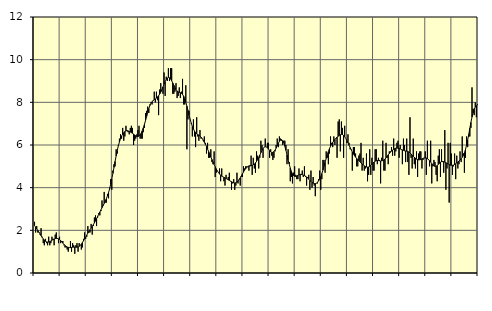
| Category | Piggar | Series 1 |
|---|---|---|
| nan | 2.4 | 2.22 |
| 87.0 | 1.9 | 2.15 |
| 87.0 | 2.2 | 2.07 |
| 87.0 | 1.9 | 2 |
| 87.0 | 1.9 | 1.92 |
| 87.0 | 1.8 | 1.84 |
| 87.0 | 2.1 | 1.75 |
| 87.0 | 1.7 | 1.67 |
| 87.0 | 1.4 | 1.6 |
| 87.0 | 1.3 | 1.54 |
| 87.0 | 1.6 | 1.49 |
| 87.0 | 1.4 | 1.46 |
| nan | 1.3 | 1.45 |
| 88.0 | 1.7 | 1.45 |
| 88.0 | 1.3 | 1.47 |
| 88.0 | 1.4 | 1.5 |
| 88.0 | 1.7 | 1.54 |
| 88.0 | 1.6 | 1.57 |
| 88.0 | 1.3 | 1.59 |
| 88.0 | 1.8 | 1.61 |
| 88.0 | 1.9 | 1.62 |
| 88.0 | 1.6 | 1.62 |
| 88.0 | 1.4 | 1.6 |
| 88.0 | 1.7 | 1.57 |
| nan | 1.4 | 1.52 |
| 89.0 | 1.5 | 1.46 |
| 89.0 | 1.5 | 1.4 |
| 89.0 | 1.3 | 1.34 |
| 89.0 | 1.2 | 1.29 |
| 89.0 | 1.2 | 1.25 |
| 89.0 | 1.1 | 1.22 |
| 89.0 | 1 | 1.2 |
| 89.0 | 1.2 | 1.19 |
| 89.0 | 1.5 | 1.19 |
| 89.0 | 1 | 1.2 |
| 89.0 | 1.4 | 1.21 |
| nan | 1.3 | 1.21 |
| 90.0 | 0.9 | 1.21 |
| 90.0 | 1.3 | 1.21 |
| 90.0 | 1.4 | 1.21 |
| 90.0 | 1 | 1.22 |
| 90.0 | 1.4 | 1.25 |
| 90.0 | 1.3 | 1.29 |
| 90.0 | 1.1 | 1.35 |
| 90.0 | 1.2 | 1.43 |
| 90.0 | 1.6 | 1.51 |
| 90.0 | 1.9 | 1.6 |
| 90.0 | 1.6 | 1.69 |
| nan | 1.7 | 1.78 |
| 91.0 | 2.2 | 1.87 |
| 91.0 | 1.9 | 1.95 |
| 91.0 | 1.9 | 2.03 |
| 91.0 | 2.3 | 2.11 |
| 91.0 | 1.8 | 2.18 |
| 91.0 | 2.2 | 2.26 |
| 91.0 | 2.6 | 2.35 |
| 91.0 | 2.7 | 2.44 |
| 91.0 | 2.2 | 2.55 |
| 91.0 | 2.6 | 2.65 |
| 91.0 | 2.8 | 2.76 |
| nan | 2.7 | 2.86 |
| 92.0 | 2.9 | 2.96 |
| 92.0 | 3.4 | 3.06 |
| 92.0 | 3.2 | 3.16 |
| 92.0 | 3.8 | 3.26 |
| 92.0 | 3.3 | 3.36 |
| 92.0 | 3.3 | 3.48 |
| 92.0 | 3.7 | 3.62 |
| 92.0 | 3.5 | 3.77 |
| 92.0 | 4 | 3.95 |
| 92.0 | 4.4 | 4.17 |
| 92.0 | 3.9 | 4.41 |
| nan | 4.8 | 4.67 |
| 93.0 | 5.1 | 4.95 |
| 93.0 | 5 | 5.23 |
| 93.0 | 5.8 | 5.49 |
| 93.0 | 5.6 | 5.74 |
| 93.0 | 6 | 5.96 |
| 93.0 | 6.3 | 6.14 |
| 93.0 | 6.5 | 6.3 |
| 93.0 | 6.3 | 6.42 |
| 93.0 | 6.8 | 6.51 |
| 93.0 | 6.2 | 6.58 |
| 93.0 | 6.4 | 6.63 |
| nan | 6.9 | 6.66 |
| 94.0 | 6.7 | 6.67 |
| 94.0 | 6.6 | 6.66 |
| 94.0 | 6.5 | 6.64 |
| 94.0 | 6.8 | 6.61 |
| 94.0 | 6.9 | 6.58 |
| 94.0 | 6.8 | 6.55 |
| 94.0 | 6 | 6.51 |
| 94.0 | 6.2 | 6.47 |
| 94.0 | 6.3 | 6.43 |
| 94.0 | 6.5 | 6.4 |
| 94.0 | 6.7 | 6.4 |
| nan | 6.9 | 6.42 |
| 95.0 | 6.3 | 6.47 |
| 95.0 | 6.3 | 6.55 |
| 95.0 | 6.3 | 6.67 |
| 95.0 | 6.6 | 6.81 |
| 95.0 | 6.8 | 6.97 |
| 95.0 | 7.5 | 7.15 |
| 95.0 | 7.6 | 7.34 |
| 95.0 | 7.8 | 7.53 |
| 95.0 | 7.5 | 7.7 |
| 95.0 | 7.9 | 7.85 |
| 95.0 | 8 | 7.96 |
| nan | 7.9 | 8.03 |
| 96.0 | 8.1 | 8.08 |
| 96.0 | 8.5 | 8.12 |
| 96.0 | 8 | 8.16 |
| 96.0 | 8.5 | 8.2 |
| 96.0 | 8.1 | 8.25 |
| 96.0 | 7.4 | 8.31 |
| 96.0 | 8.6 | 8.39 |
| 96.0 | 8.9 | 8.48 |
| 96.0 | 8.6 | 8.59 |
| 96.0 | 8.4 | 8.72 |
| 96.0 | 9.4 | 8.85 |
| nan | 8.3 | 8.97 |
| 97.0 | 9.2 | 9.07 |
| 97.0 | 9 | 9.14 |
| 97.0 | 9.6 | 9.17 |
| 97.0 | 9 | 9.15 |
| 97.0 | 9.6 | 9.1 |
| 97.0 | 9.6 | 9.01 |
| 97.0 | 8.4 | 8.91 |
| 97.0 | 8.4 | 8.8 |
| 97.0 | 8.5 | 8.69 |
| 97.0 | 8.9 | 8.6 |
| 97.0 | 8.2 | 8.53 |
| nan | 8.3 | 8.49 |
| 98.0 | 8.7 | 8.47 |
| 98.0 | 8.2 | 8.45 |
| 98.0 | 8.5 | 8.42 |
| 98.0 | 9.1 | 8.37 |
| 98.0 | 7.9 | 8.29 |
| 98.0 | 7.9 | 8.17 |
| 98.0 | 8.8 | 8.01 |
| 98.0 | 5.8 | 7.82 |
| 98.0 | 7.2 | 7.62 |
| 98.0 | 7.6 | 7.41 |
| 98.0 | 7.2 | 7.21 |
| nan | 7 | 7.03 |
| 99.0 | 6.4 | 6.87 |
| 99.0 | 7.2 | 6.75 |
| 99.0 | 6.4 | 6.65 |
| 99.0 | 5.9 | 6.58 |
| 99.0 | 7.3 | 6.53 |
| 99.0 | 6.4 | 6.49 |
| 99.0 | 6.2 | 6.46 |
| 99.0 | 6.7 | 6.42 |
| 99.0 | 6.3 | 6.37 |
| 99.0 | 6.3 | 6.31 |
| 99.0 | 6.2 | 6.23 |
| nan | 6.4 | 6.13 |
| 0.0 | 6.1 | 6.03 |
| 0.0 | 5.6 | 5.93 |
| 0.0 | 6.1 | 5.81 |
| 0.0 | 5.4 | 5.69 |
| 0.0 | 5.4 | 5.57 |
| 0.0 | 5.8 | 5.44 |
| 0.0 | 5.2 | 5.32 |
| 0.0 | 5.1 | 5.2 |
| 0.0 | 5.7 | 5.09 |
| 0.0 | 4.5 | 4.98 |
| 0.0 | 4.7 | 4.88 |
| nan | 4.8 | 4.79 |
| 1.0 | 4.7 | 4.71 |
| 1.0 | 4.9 | 4.64 |
| 1.0 | 4.3 | 4.58 |
| 1.0 | 4.9 | 4.54 |
| 1.0 | 4.5 | 4.51 |
| 1.0 | 4.3 | 4.48 |
| 1.0 | 4.1 | 4.46 |
| 1.0 | 4.6 | 4.43 |
| 1.0 | 4.4 | 4.4 |
| 1.0 | 4.5 | 4.37 |
| 1.0 | 4.7 | 4.34 |
| nan | 4.3 | 4.31 |
| 2.0 | 3.9 | 4.28 |
| 2.0 | 4.2 | 4.25 |
| 2.0 | 4.4 | 4.23 |
| 2.0 | 3.9 | 4.22 |
| 2.0 | 4.1 | 4.23 |
| 2.0 | 4.7 | 4.26 |
| 2.0 | 4.2 | 4.31 |
| 2.0 | 4.4 | 4.38 |
| 2.0 | 4.1 | 4.46 |
| 2.0 | 4.5 | 4.55 |
| 2.0 | 4.5 | 4.64 |
| nan | 5 | 4.73 |
| 3.0 | 4.9 | 4.82 |
| 3.0 | 5 | 4.89 |
| 3.0 | 5 | 4.95 |
| 3.0 | 5 | 4.99 |
| 3.0 | 4.8 | 5.02 |
| 3.0 | 5 | 5.03 |
| 3.0 | 5.5 | 5.04 |
| 3.0 | 4.6 | 5.05 |
| 3.0 | 5.4 | 5.08 |
| 3.0 | 4.9 | 5.11 |
| 3.0 | 4.7 | 5.16 |
| nan | 5.7 | 5.23 |
| 4.0 | 5.5 | 5.32 |
| 4.0 | 4.9 | 5.41 |
| 4.0 | 5.4 | 5.52 |
| 4.0 | 6.2 | 5.64 |
| 4.0 | 6 | 5.75 |
| 4.0 | 5.4 | 5.84 |
| 4.0 | 5.9 | 5.9 |
| 4.0 | 6.3 | 5.92 |
| 4.0 | 5.9 | 5.91 |
| 4.0 | 6.1 | 5.87 |
| 4.0 | 6.1 | 5.81 |
| nan | 5.4 | 5.74 |
| 5.0 | 5.8 | 5.69 |
| 5.0 | 5.5 | 5.65 |
| 5.0 | 5.3 | 5.65 |
| 5.0 | 5.4 | 5.69 |
| 5.0 | 5.7 | 5.76 |
| 5.0 | 6 | 5.85 |
| 5.0 | 6.3 | 5.97 |
| 5.0 | 5.9 | 6.08 |
| 5.0 | 6.4 | 6.17 |
| 5.0 | 6.3 | 6.23 |
| 5.0 | 6.2 | 6.25 |
| nan | 6 | 6.2 |
| 6.0 | 6.2 | 6.1 |
| 6.0 | 6.2 | 5.94 |
| 6.0 | 6 | 5.75 |
| 6.0 | 5.1 | 5.53 |
| 6.0 | 5.8 | 5.31 |
| 6.0 | 5.2 | 5.11 |
| 6.0 | 4.3 | 4.92 |
| 6.0 | 4.5 | 4.76 |
| 6.0 | 4.2 | 4.65 |
| 6.0 | 4.7 | 4.57 |
| 6.0 | 5 | 4.53 |
| nan | 4.6 | 4.53 |
| 7.0 | 4.4 | 4.55 |
| 7.0 | 4.4 | 4.58 |
| 7.0 | 4.9 | 4.6 |
| 7.0 | 4.3 | 4.62 |
| 7.0 | 4.6 | 4.63 |
| 7.0 | 4.8 | 4.61 |
| 7.0 | 4.5 | 4.59 |
| 7.0 | 5 | 4.57 |
| 7.0 | 4.5 | 4.54 |
| 7.0 | 4.1 | 4.5 |
| 7.0 | 4.5 | 4.45 |
| nan | 4.6 | 4.4 |
| 8.0 | 3.9 | 4.34 |
| 8.0 | 4.8 | 4.29 |
| 8.0 | 4 | 4.25 |
| 8.0 | 4.5 | 4.21 |
| 8.0 | 4.1 | 4.19 |
| 8.0 | 3.6 | 4.19 |
| 8.0 | 4.2 | 4.21 |
| 8.0 | 4.2 | 4.25 |
| 8.0 | 4.4 | 4.32 |
| 8.0 | 4.8 | 4.4 |
| 8.0 | 3.9 | 4.52 |
| nan | 4.4 | 4.66 |
| 9.0 | 5.3 | 4.82 |
| 9.0 | 5.3 | 5 |
| 9.0 | 4.7 | 5.18 |
| 9.0 | 5.7 | 5.37 |
| 9.0 | 5.4 | 5.54 |
| 9.0 | 5.1 | 5.69 |
| 9.0 | 5.6 | 5.83 |
| 9.0 | 6.4 | 5.94 |
| 9.0 | 6.1 | 6.03 |
| 9.0 | 5.9 | 6.12 |
| 9.0 | 6.4 | 6.19 |
| nan | 6 | 6.26 |
| 10.0 | 6.3 | 6.32 |
| 10.0 | 5.4 | 6.37 |
| 10.0 | 7.1 | 6.41 |
| 10.0 | 7.2 | 6.45 |
| 10.0 | 5.7 | 6.48 |
| 10.0 | 7.1 | 6.5 |
| 10.0 | 6.8 | 6.49 |
| 10.0 | 5.4 | 6.45 |
| 10.0 | 6.9 | 6.39 |
| 10.0 | 6.3 | 6.3 |
| 10.0 | 6.1 | 6.21 |
| nan | 6.5 | 6.1 |
| 11.0 | 6.1 | 5.99 |
| 11.0 | 5.8 | 5.88 |
| 11.0 | 5.8 | 5.78 |
| 11.0 | 4.8 | 5.67 |
| 11.0 | 5.9 | 5.58 |
| 11.0 | 5.9 | 5.5 |
| 11.0 | 5.6 | 5.43 |
| 11.0 | 5 | 5.37 |
| 11.0 | 5 | 5.32 |
| 11.0 | 5.5 | 5.27 |
| 11.0 | 5.6 | 5.22 |
| nan | 6.1 | 5.16 |
| 12.0 | 4.8 | 5.11 |
| 12.0 | 5.4 | 5.07 |
| 12.0 | 4.8 | 5.02 |
| 12.0 | 4.9 | 4.99 |
| 12.0 | 5.6 | 4.97 |
| 12.0 | 4.3 | 4.96 |
| 12.0 | 4.6 | 4.97 |
| 12.0 | 5.8 | 5 |
| 12.0 | 4.6 | 5.05 |
| 12.0 | 5.4 | 5.1 |
| 12.0 | 4.8 | 5.16 |
| nan | 4.8 | 5.2 |
| 13.0 | 5.8 | 5.24 |
| 13.0 | 5.8 | 5.26 |
| 13.0 | 5.1 | 5.27 |
| 13.0 | 5.4 | 5.27 |
| 13.0 | 5.3 | 5.26 |
| 13.0 | 4.2 | 5.25 |
| 13.0 | 5.4 | 5.26 |
| 13.0 | 6.2 | 5.27 |
| 13.0 | 4.8 | 5.3 |
| 13.0 | 4.8 | 5.34 |
| 13.0 | 6.1 | 5.4 |
| nan | 5.4 | 5.47 |
| 14.0 | 5.1 | 5.54 |
| 14.0 | 5.7 | 5.6 |
| 14.0 | 5.7 | 5.66 |
| 14.0 | 5.9 | 5.72 |
| 14.0 | 5.5 | 5.76 |
| 14.0 | 6.3 | 5.8 |
| 14.0 | 5.5 | 5.83 |
| 14.0 | 5.7 | 5.85 |
| 14.0 | 6.1 | 5.86 |
| 14.0 | 6.2 | 5.85 |
| 14.0 | 5.4 | 5.84 |
| nan | 6 | 5.82 |
| 15.0 | 5.8 | 5.79 |
| 15.0 | 5.1 | 5.77 |
| 15.0 | 6.3 | 5.75 |
| 15.0 | 6 | 5.73 |
| 15.0 | 5.2 | 5.72 |
| 15.0 | 6.3 | 5.71 |
| 15.0 | 5.2 | 5.7 |
| 15.0 | 4.6 | 5.67 |
| 15.0 | 7.3 | 5.63 |
| 15.0 | 5.4 | 5.58 |
| 15.0 | 4.9 | 5.53 |
| nan | 6.3 | 5.47 |
| 16.0 | 5.1 | 5.42 |
| 16.0 | 4.9 | 5.38 |
| 16.0 | 5.7 | 5.34 |
| 16.0 | 4.5 | 5.32 |
| 16.0 | 5.6 | 5.3 |
| 16.0 | 5.7 | 5.31 |
| 16.0 | 5.7 | 5.32 |
| 16.0 | 4.9 | 5.35 |
| 16.0 | 5.3 | 5.37 |
| 16.0 | 5.4 | 5.39 |
| 16.0 | 5.7 | 5.39 |
| nan | 4.6 | 5.39 |
| 17.0 | 6.2 | 5.36 |
| 17.0 | 5.3 | 5.32 |
| 17.0 | 5 | 5.26 |
| 17.0 | 6.2 | 5.2 |
| 17.0 | 4.2 | 5.13 |
| 17.0 | 5 | 5.07 |
| 17.0 | 5.3 | 5.02 |
| 17.0 | 5.2 | 5 |
| 17.0 | 4.6 | 5 |
| 17.0 | 4.3 | 5.04 |
| 17.0 | 5.5 | 5.09 |
| nan | 5.8 | 5.14 |
| 18.0 | 4.5 | 5.19 |
| 18.0 | 5.8 | 5.22 |
| 18.0 | 5.2 | 5.23 |
| 18.0 | 4.7 | 5.22 |
| 18.0 | 6.7 | 5.2 |
| 18.0 | 3.9 | 5.17 |
| 18.0 | 4.9 | 5.14 |
| 18.0 | 6.1 | 5.11 |
| 18.0 | 3.3 | 5.08 |
| 18.0 | 6.1 | 5.06 |
| 18.0 | 5.6 | 5.05 |
| nan | 4.6 | 5.05 |
| 19.0 | 5 | 5.06 |
| 19.0 | 5.6 | 5.09 |
| 19.0 | 4.4 | 5.12 |
| 19.0 | 5.5 | 5.16 |
| 19.0 | 4.9 | 5.2 |
| 19.0 | 5.1 | 5.25 |
| 19.0 | 5.7 | 5.3 |
| 19.0 | 5.2 | 5.35 |
| 19.0 | 6.4 | 5.42 |
| 19.0 | 5.6 | 5.51 |
| 19.0 | 4.7 | 5.63 |
| nan | 5.4 | 5.79 |
| 20.0 | 6.4 | 6 |
| 20.0 | 5.9 | 6.24 |
| 20.0 | 6.4 | 6.5 |
| 20.0 | 6.4 | 6.79 |
| 20.0 | 6.8 | 7.06 |
| 20.0 | 8.7 | 7.31 |
| 20.0 | 7.7 | 7.51 |
| 20.0 | 7.4 | 7.67 |
| 20.0 | 8 | 7.78 |
| 20.0 | 7.3 | 7.84 |
| 20.0 | 7.9 | 7.87 |